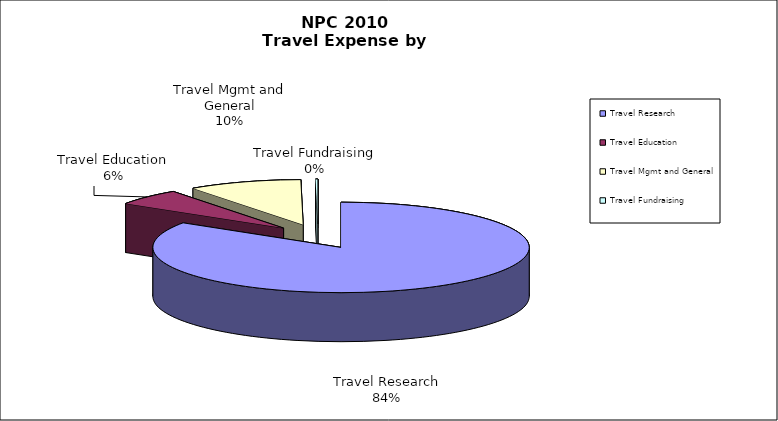
| Category | Series 0 |
|---|---|
| Travel Research | 3897710 |
| Travel Education | 272762 |
| Travel Mgmt and General | 452318 |
| Travel Fundraising | 9383 |